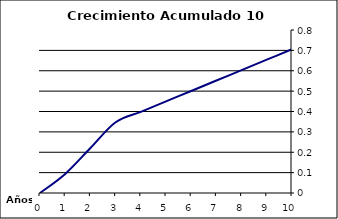
| Category | Series 0 |
|---|---|
| 0.0 | 0 |
| 1.0 | 0.094 |
| 2.0 | 0.221 |
| 3.0 | 0.347 |
| 4.0 | 0.399 |
| 5.0 | 0.45 |
| 6.0 | 0.501 |
| 7.0 | 0.552 |
| 8.0 | 0.603 |
| 9.0 | 0.654 |
| 10.0 | 0.705 |